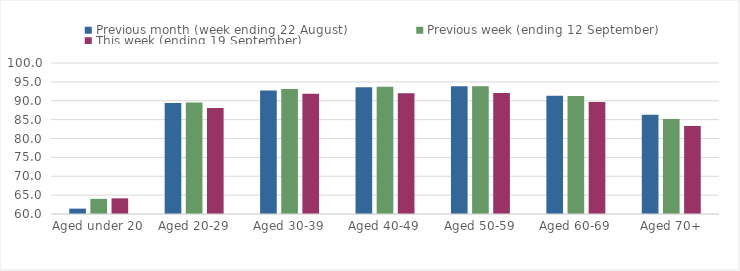
| Category | Previous month (week ending 22 August) | Previous week (ending 12 September) | This week (ending 19 September) |
|---|---|---|---|
| Aged under 20 | 61.42 | 64.01 | 64.15 |
| Aged 20-29 | 89.42 | 89.56 | 88.06 |
| Aged 30-39 | 92.72 | 93.12 | 91.87 |
| Aged 40-49 | 93.55 | 93.71 | 91.97 |
| Aged 50-59 | 93.87 | 93.85 | 92.06 |
| Aged 60-69 | 91.33 | 91.29 | 89.67 |
| Aged 70+ | 86.29 | 85.15 | 83.28 |